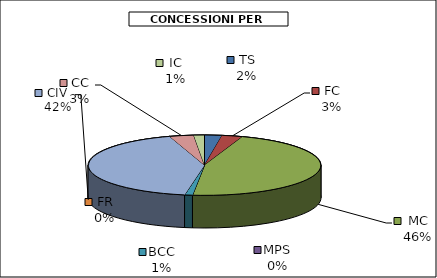
| Category | Series 0 |
|---|---|
| TS | 4426 |
| FC | 5241.125 |
| MC | 84706.25 |
| MPS | 0 |
| BCC | 1995 |
| FR | 0 |
| CIV | 77527.5 |
| CC | 6135 |
| IC | 2708.25 |